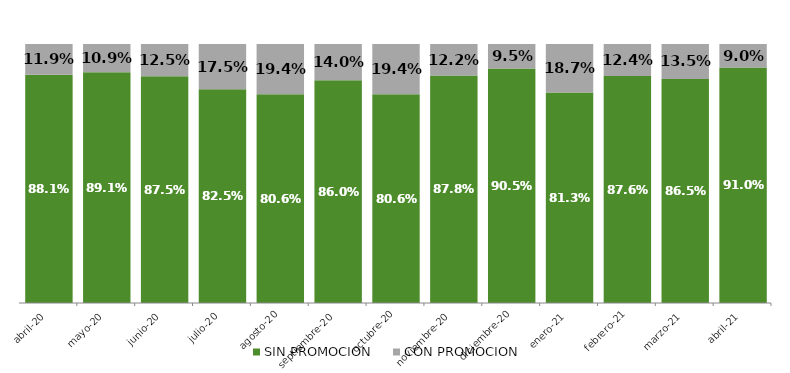
| Category | SIN PROMOCION   | CON PROMOCION   |
|---|---|---|
| 2020-04-01 | 0.881 | 0.119 |
| 2020-05-01 | 0.891 | 0.109 |
| 2020-06-01 | 0.875 | 0.125 |
| 2020-07-01 | 0.825 | 0.175 |
| 2020-08-01 | 0.806 | 0.194 |
| 2020-09-01 | 0.86 | 0.14 |
| 2020-10-01 | 0.806 | 0.194 |
| 2020-11-01 | 0.878 | 0.122 |
| 2020-12-01 | 0.905 | 0.095 |
| 2021-01-01 | 0.813 | 0.187 |
| 2021-02-01 | 0.876 | 0.124 |
| 2021-03-01 | 0.865 | 0.135 |
| 2021-04-01 | 0.91 | 0.09 |